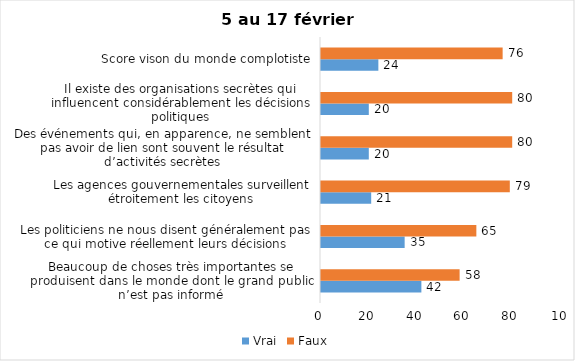
| Category | Vrai | Faux |
|---|---|---|
| Beaucoup de choses très importantes se produisent dans le monde dont le grand public n’est pas informé | 42 | 58 |
| Les politiciens ne nous disent généralement pas ce qui motive réellement leurs décisions | 35 | 65 |
| Les agences gouvernementales surveillent étroitement les citoyens | 21 | 79 |
| Des événements qui, en apparence, ne semblent pas avoir de lien sont souvent le résultat d’activités secrètes | 20 | 80 |
| Il existe des organisations secrètes qui influencent considérablement les décisions politiques | 20 | 80 |
| Score vison du monde complotiste | 24 | 76 |